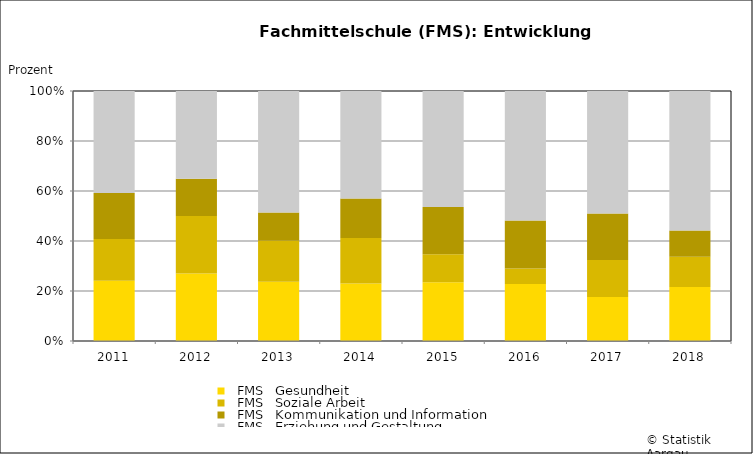
| Category |   FMS   Gesundheit |   FMS   Soziale Arbeit |   FMS   Kommunikation und Information |   FMS   Erziehung und Gestaltung |
|---|---|---|---|---|
| 2011 | 46 | 32 | 35 | 78 |
| 2012 | 40 | 34 | 22 | 52 |
| 2013 | 42 | 29 | 20 | 86 |
| 2014 | 38 | 30 | 26 | 71 |
| 2015 | 46 | 22 | 37 | 91 |
| 2016 | 44 | 12 | 37 | 100 |
| 2017 | 36 | 30 | 38 | 100 |
| 2018 | 41 | 23 | 20 | 106 |